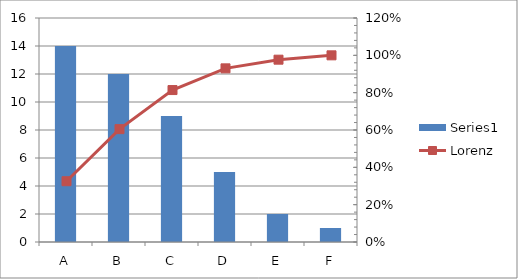
| Category | Series 0 |
|---|---|
| A | 14 |
| B | 12 |
| C | 9 |
| D | 5 |
| E | 2 |
| F | 1 |